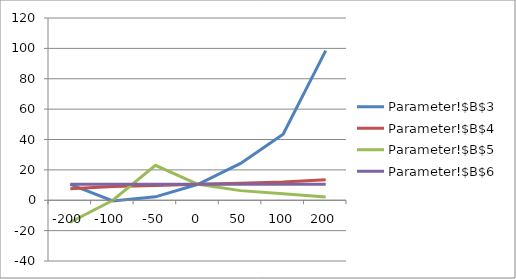
| Category | Parameter!$B$3 | Parameter!$B$4 | Parameter!$B$5 | Parameter!$B$6 |
|---|---|---|---|---|
| -200.0 | 10.5 | 7.5 | -14.5 | 10.5 |
| -100.0 | -0.5 | 9 | 0 | 10.5 |
| -50.0 | 2.25 | 9.75 | 23 | 10.5 |
| 0.0 | 10.5 | 10.5 | 10.5 | 10.5 |
| 50.0 | 24.25 | 11.25 | 6.333 | 10.5 |
| 100.0 | 43.5 | 12 | 4.25 | 10.5 |
| 200.0 | 98.5 | 13.5 | 2.167 | 10.5 |